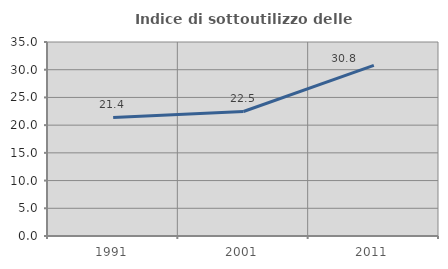
| Category | Indice di sottoutilizzo delle abitazioni  |
|---|---|
| 1991.0 | 21.379 |
| 2001.0 | 22.464 |
| 2011.0 | 30.769 |